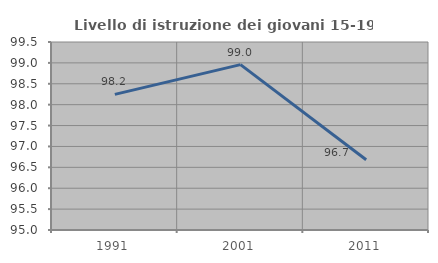
| Category | Livello di istruzione dei giovani 15-19 anni |
|---|---|
| 1991.0 | 98.246 |
| 2001.0 | 98.958 |
| 2011.0 | 96.682 |